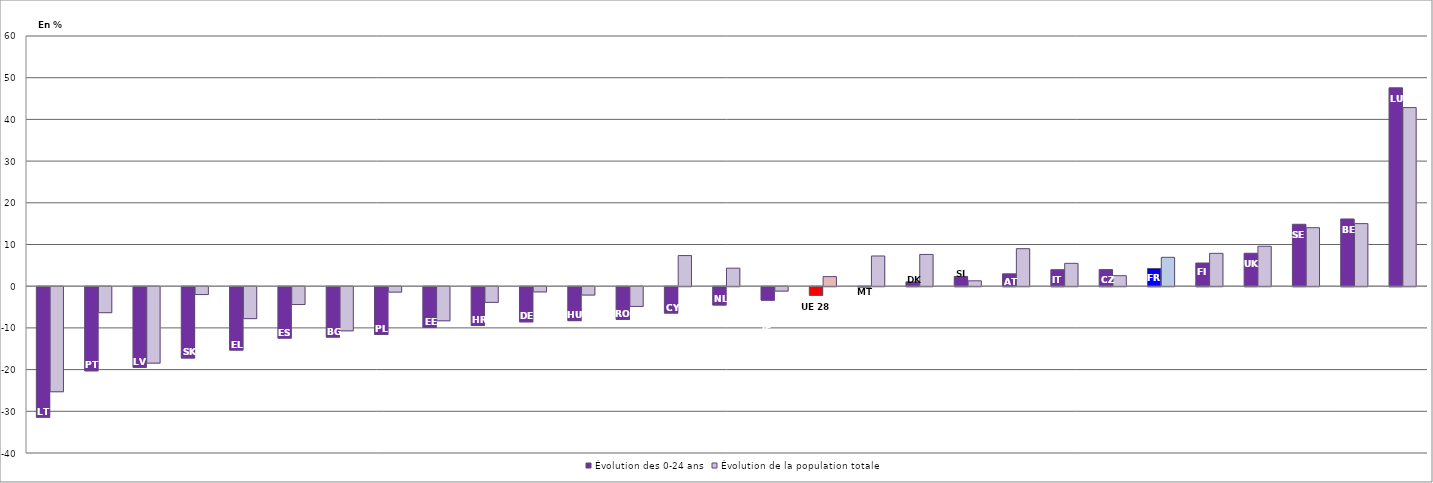
| Category | Évolution des 0-24 ans | Évolution de la population totale  |
|---|---|---|
| LT | -31.285 | -25.192 |
| PT | -20.171 | -6.231 |
| LV | -19.342 | -18.329 |
| SK | -17.088 | -1.882 |
| EL | -15.196 | -7.658 |
| ES | -12.323 | -4.274 |
| BG | -12.081 | -10.585 |
| PL | -11.457 | -1.294 |
| EE | -9.748 | -8.175 |
| HR | -9.3 | -3.762 |
| DE | -8.418 | -1.25 |
| HU | -8.137 | -2.005 |
| RO | -7.837 | -4.731 |
| CY | -6.32 | 7.349 |
| NL | -4.384 | 4.324 |
| IE | -3.229 | -1.055 |
| UE 28 | -2.049 | 2.299 |
| MT | -0.068 | 7.247 |
| DK | 1.034 | 7.617 |
| SI | 2.34 | 1.289 |
| AT | 2.967 | 8.997 |
| IT | 3.954 | 5.483 |
| CZ | 3.978 | 2.528 |
| FR | 4.249 | 6.927 |
| FI | 5.557 | 7.88 |
| UK | 7.9 | 9.581 |
| SE | 14.85 | 14.031 |
| BE | 16.12 | 15.007 |
| LU | 47.573 | 42.838 |